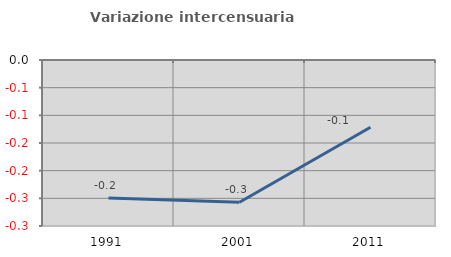
| Category | Variazione intercensuaria annua |
|---|---|
| 1991.0 | -0.249 |
| 2001.0 | -0.257 |
| 2011.0 | -0.122 |